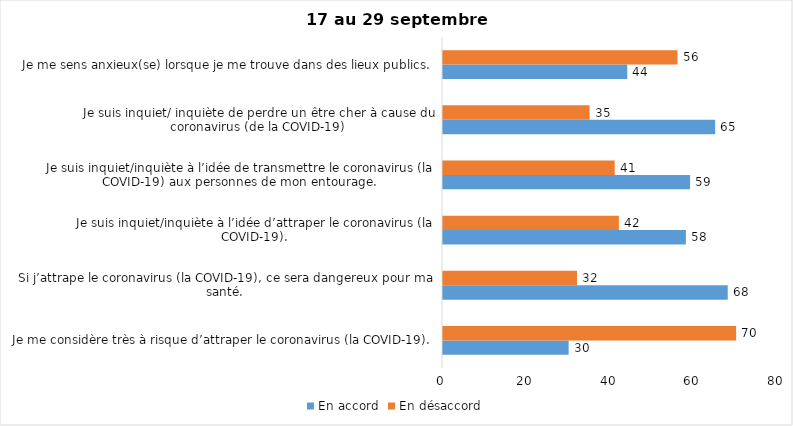
| Category | En accord | En désaccord |
|---|---|---|
| Je me considère très à risque d’attraper le coronavirus (la COVID-19). | 30 | 70 |
| Si j’attrape le coronavirus (la COVID-19), ce sera dangereux pour ma santé. | 68 | 32 |
| Je suis inquiet/inquiète à l’idée d’attraper le coronavirus (la COVID-19). | 58 | 42 |
| Je suis inquiet/inquiète à l’idée de transmettre le coronavirus (la COVID-19) aux personnes de mon entourage. | 59 | 41 |
| Je suis inquiet/ inquiète de perdre un être cher à cause du coronavirus (de la COVID-19) | 65 | 35 |
| Je me sens anxieux(se) lorsque je me trouve dans des lieux publics. | 44 | 56 |